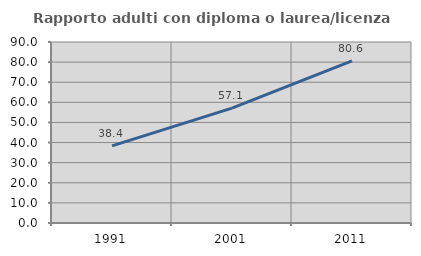
| Category | Rapporto adulti con diploma o laurea/licenza media  |
|---|---|
| 1991.0 | 38.372 |
| 2001.0 | 57.143 |
| 2011.0 | 80.571 |